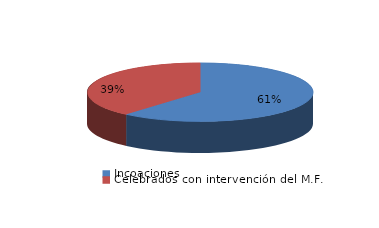
| Category | Series 0 |
|---|---|
| Incoaciones | 3373 |
| Celebrados con intervención del M.F. | 2132 |